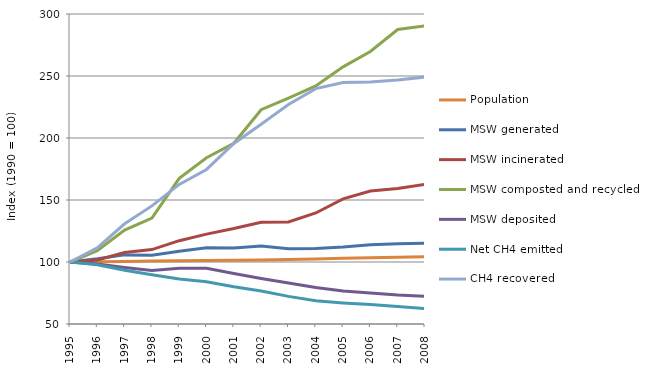
| Category | Population | MSW generated | MSW incinerated | MSW composted and recycled | MSW deposited | Net CH4 emitted | CH4 recovered |
|---|---|---|---|---|---|---|---|
| 1995.0 | 100 | 100 | 100 | 100 | 100 | 100 | 100 |
| 1996.0 | 100.177 | 102.558 | 101.604 | 109.083 | 98.356 | 97.782 | 111.341 |
| 1997.0 | 100.34 | 105.735 | 107.629 | 125.666 | 95.65 | 93.324 | 130.837 |
| 1998.0 | 100.82 | 105.399 | 110.003 | 135.373 | 93.199 | 89.739 | 145.241 |
| 1999.0 | 100.966 | 108.618 | 117.184 | 167.449 | 94.921 | 86.319 | 162.551 |
| 2000.0 | 101.207 | 111.465 | 122.472 | 184.078 | 94.869 | 84.033 | 174.644 |
| 2001.0 | 101.423 | 111.389 | 126.953 | 195.739 | 90.668 | 79.98 | 195.644 |
| 2002.0 | 101.599 | 112.847 | 132.085 | 222.794 | 86.746 | 76.588 | 211.037 |
| 2003.0 | 102.021 | 110.736 | 132.342 | 232.189 | 83.009 | 72.279 | 227.084 |
| 2004.0 | 102.472 | 110.91 | 139.528 | 242.004 | 79.506 | 68.689 | 239.816 |
| 2005.0 | 102.965 | 112.059 | 150.972 | 257.345 | 76.529 | 66.997 | 244.78 |
| 2006.0 | 103.4 | 113.831 | 157.279 | 269.781 | 75.026 | 65.719 | 245.261 |
| 2007.0 | 103.836 | 114.789 | 159.288 | 287.522 | 73.33 | 64.169 | 246.836 |
| 2008.0 | 104.326 | 115.128 | 162.568 | 290.446 | 72.258 | 62.397 | 249.184 |